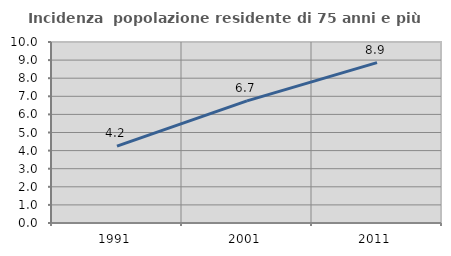
| Category | Incidenza  popolazione residente di 75 anni e più |
|---|---|
| 1991.0 | 4.245 |
| 2001.0 | 6.749 |
| 2011.0 | 8.862 |